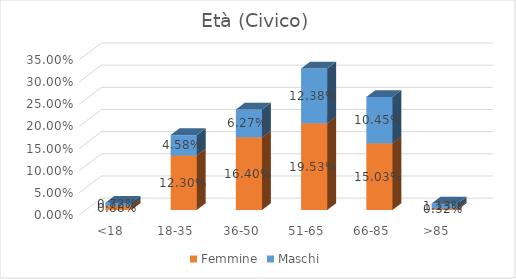
| Category | Femmine | Maschi |
|---|---|---|
| <18 | 0.009 | 0.007 |
| 18-35 | 0.123 | 0.046 |
| 36-50 | 0.164 | 0.063 |
| 51-65 | 0.195 | 0.124 |
| 66-85 | 0.15 | 0.105 |
| >85 | 0.003 | 0.011 |